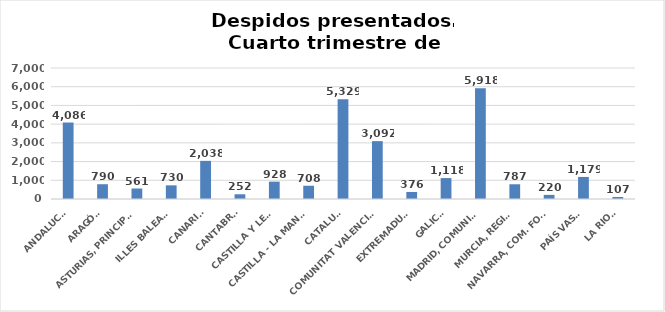
| Category | Series 0 |
|---|---|
| ANDALUCÍA | 4086 |
| ARAGÓN | 790 |
| ASTURIAS, PRINCIPADO | 561 |
| ILLES BALEARS | 730 |
| CANARIAS | 2038 |
| CANTABRIA | 252 |
| CASTILLA Y LEÓN | 928 |
| CASTILLA - LA MANCHA | 708 |
| CATALUÑA | 5329 |
| COMUNITAT VALENCIANA | 3092 |
| EXTREMADURA | 376 |
| GALICIA | 1118 |
| MADRID, COMUNIDAD | 5918 |
| MURCIA, REGIÓN | 787 |
| NAVARRA, COM. FORAL | 220 |
| PAÍS VASCO | 1179 |
| LA RIOJA | 107 |